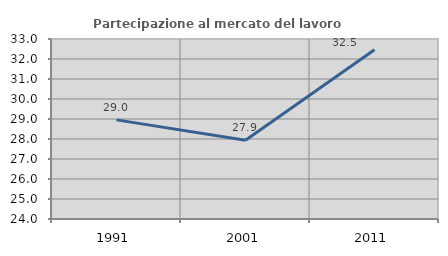
| Category | Partecipazione al mercato del lavoro  femminile |
|---|---|
| 1991.0 | 28.956 |
| 2001.0 | 27.942 |
| 2011.0 | 32.462 |